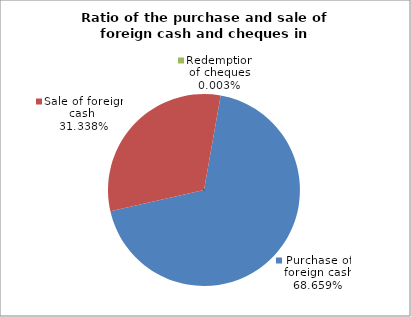
| Category | Purchase of foreign cash |
|---|---|
| 0 | 0.687 |
| 1 | 0.313 |
| 2 | 0 |